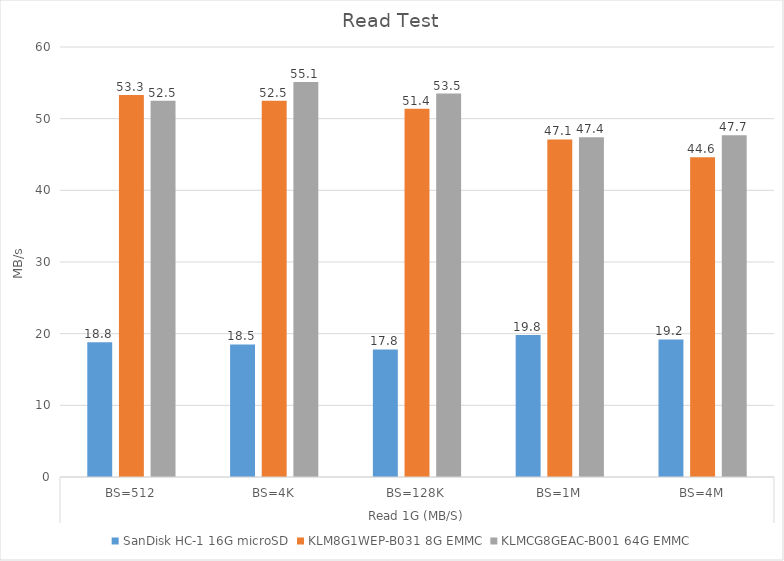
| Category | SanDisk HC-1 16G microSD | KLM8G1WEP-B031 8G EMMC | KLMCG8GEAC-B001 64G EMMC |
|---|---|---|---|
| 0 | 18.8 | 53.3 | 52.5 |
| 1 | 18.5 | 52.5 | 55.1 |
| 2 | 17.8 | 51.4 | 53.5 |
| 3 | 19.8 | 47.1 | 47.4 |
| 4 | 19.2 | 44.6 | 47.7 |